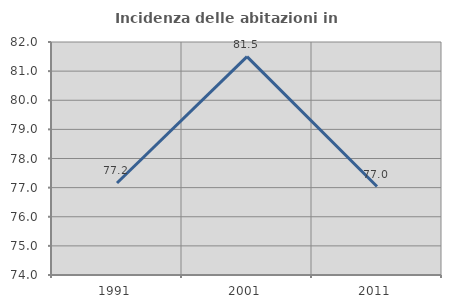
| Category | Incidenza delle abitazioni in proprietà  |
|---|---|
| 1991.0 | 77.16 |
| 2001.0 | 81.497 |
| 2011.0 | 77.037 |